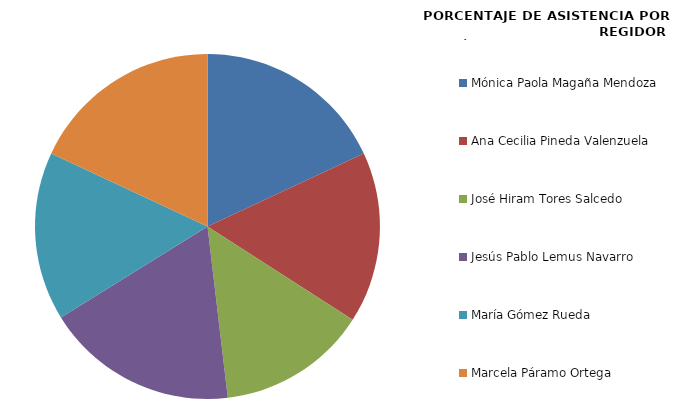
| Category | Series 0 |
|---|---|
| Mónica Paola Magaña Mendoza | 100 |
| Ana Cecilia Pineda Valenzuela | 88.889 |
| José Hiram Tores Salcedo | 77.778 |
| Jesús Pablo Lemus Navarro | 100 |
| María Gómez Rueda | 87.5 |
| Marcela Páramo Ortega | 100 |